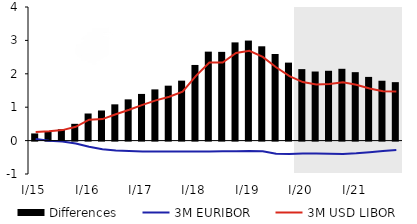
| Category | Differences |
|---|---|
| I/15 | 0.215 |
| II | 0.286 |
| III | 0.342 |
| IV | 0.502 |
| I/16 | 0.811 |
| II | 0.902 |
| III | 1.086 |
| IV | 1.235 |
| I/17 | 1.397 |
| II | 1.533 |
| III | 1.645 |
| IV | 1.795 |
| I/18 | 2.265 |
| II | 2.663 |
| III | 2.657 |
| IV | 2.941 |
| I/19 | 2.995 |
| II | 2.824 |
| III | 2.593 |
| IV | 2.335 |
| I/20 | 2.14 |
| II | 2.068 |
| III | 2.09 |
| IV | 2.15 |
| I/21 | 2.049 |
| II | 1.907 |
| III | 1.792 |
| IV | 1.75 |